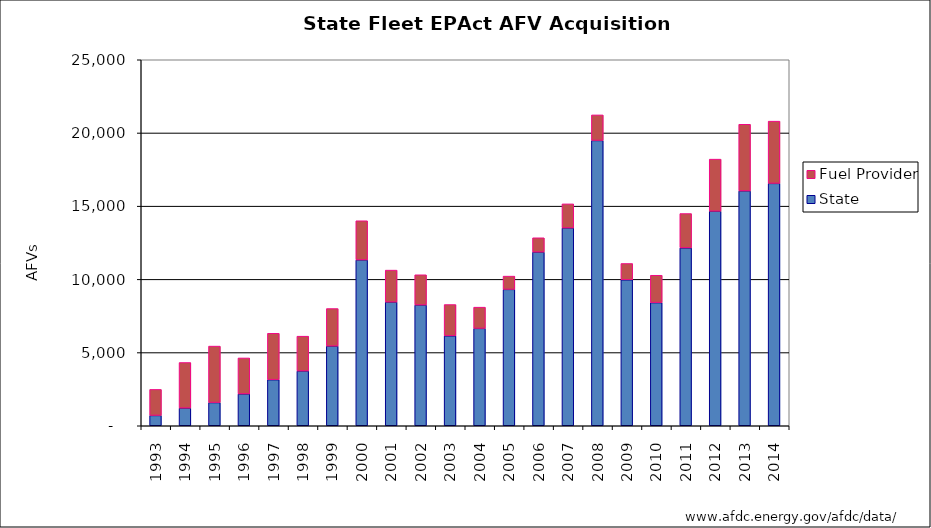
| Category | State   | Fuel Provider |
|---|---|---|
| 1993.0 | 705 | 1778 |
| 1994.0 | 1208 | 3113 |
| 1995.0 | 1587 | 3855 |
| 1996.0 | 2174 | 2457 |
| 1997.0 | 3148 | 3169 |
| 1998.0 | 3741 | 2378 |
| 1999.0 | 5443 | 2564 |
| 2000.0 | 11327 | 2676 |
| 2001.0 | 8448 | 2184 |
| 2002.0 | 8248 | 2065 |
| 2003.0 | 6143 | 2137 |
| 2004.0 | 6652 | 1449 |
| 2005.0 | 9316 | 906 |
| 2006.0 | 11863 | 977 |
| 2007.0 | 13510 | 1646 |
| 2008.0 | 19488 | 1745 |
| 2009.0 | 9971 | 1113 |
| 2010.0 | 8412 | 1869 |
| 2011.0 | 12150 | 2346 |
| 2012.0 | 14655 | 3558 |
| 2013.0 | 16042 | 4552 |
| 2014.0 | 16556 | 4251 |